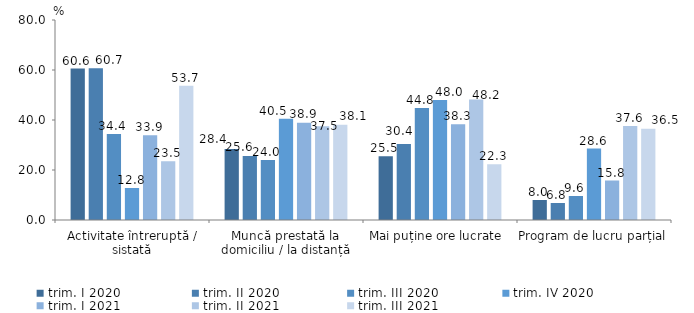
| Category | trim. I 2020 | trim. II 2020 | trim. III 2020 | trim. IV 2020 | trim. I 2021 | trim. II 2021 | trim. III 2021 |
|---|---|---|---|---|---|---|---|
| Activitate întreruptă / sistată | 60.6 | 60.7 | 34.4 | 12.8 | 33.9 | 23.5 | 53.7 |
| Muncă prestată la domiciliu / la distanță | 28.4 | 25.6 | 24 | 40.5 | 38.9 | 37.5 | 38.1 |
| Mai puține ore lucrate  | 25.5 | 30.4 | 44.8 | 48 | 38.3 | 48.2 | 22.3 |
| Program de lucru parțial | 8 | 6.8 | 9.6 | 28.6 | 15.8 | 37.6 | 36.5 |